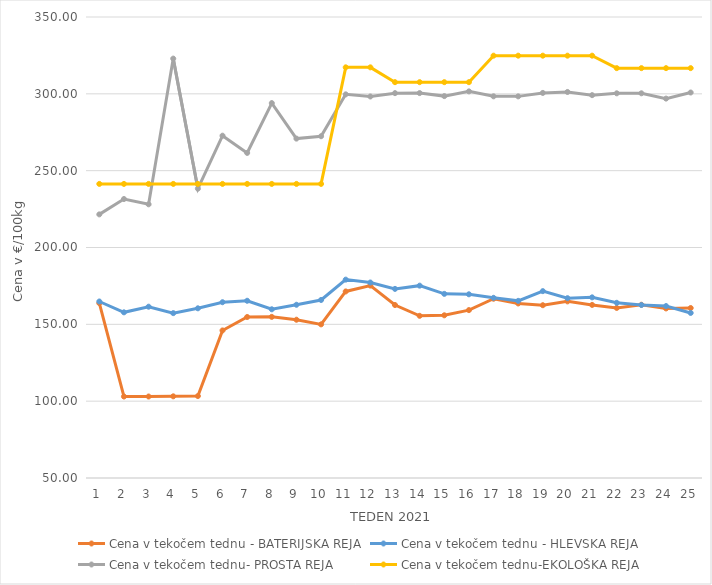
| Category | Cena v tekočem tednu - BATERIJSKA REJA | Cena v tekočem tednu - HLEVSKA REJA | Cena v tekočem tednu- PROSTA REJA | Cena v tekočem tednu-EKOLOŠKA REJA |
|---|---|---|---|---|
| 1.0 | 163.81 | 164.86 | 221.55 | 241.38 |
| 2.0 | 103.02 | 157.81 | 231.55 | 241.38 |
| 3.0 | 103.03 | 161.48 | 228.1 | 241.38 |
| 4.0 | 103.15 | 157.29 | 322.93 | 241.38 |
| 5.0 | 103.34 | 160.43 | 238.28 | 241.38 |
| 6.0 | 146.03 | 164.39 | 272.76 | 241.38 |
| 7.0 | 154.77 | 165.34 | 261.55 | 241.38 |
| 8.0 | 154.86 | 159.79 | 293.97 | 241.38 |
| 9.0 | 153 | 162.73 | 270.86 | 241.38 |
| 10.0 | 149.98 | 165.85 | 272.41 | 241.38 |
| 11.0 | 171.4 | 179.09 | 299.66 | 317.24 |
| 12.0 | 175.2 | 177.21 | 298.27 | 317.24 |
| 13.0 | 162.57 | 173.07 | 300.45 | 307.59 |
| 14.0 | 155.55 | 175.17 | 300.49 | 307.59 |
| 15.0 | 155.88 | 169.83 | 298.52 | 307.59 |
| 16.0 | 159.26 | 169.55 | 301.6 | 307.59 |
| 17.0 | 166.66 | 167.25 | 298.38 | 324.83 |
| 18.0 | 163.58 | 165.28 | 298.35 | 324.83 |
| 19.0 | 162.44 | 171.6 | 300.59 | 324.83 |
| 20.0 | 164.94 | 167.01 | 301.21 | 324.83 |
| 21.0 | 162.64 | 167.56 | 299.14 | 324.83 |
| 22.0 | 160.68 | 164.01 | 300.34 | 316.72 |
| 23.0 | 162.75 | 162.58 | 300.35 | 316.72 |
| 24.0 | 160.34 | 161.89 | 296.9 | 316.72 |
| 25.0 | 160.61 | 157.42 | 300.86 | 316.72 |